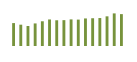
| Category | Saldo [ (1)-(2) ] |
|---|---|
| 0 | 532729.955 |
| 1 | 495602.949 |
| 2 | 464912.543 |
| 3 | 524886.84 |
| 4 | 575003.691 |
| 5 | 617133.535 |
| 6 | 598394.561 |
| 7 | 601130.812 |
| 8 | 618778.996 |
| 9 | 613783.089 |
| 10 | 640835.074 |
| 11 | 645614.486 |
| 12 | 650194 |
| 13 | 689934.963 |
| 14 | 758215.887 |
| 15 | 741412.788 |